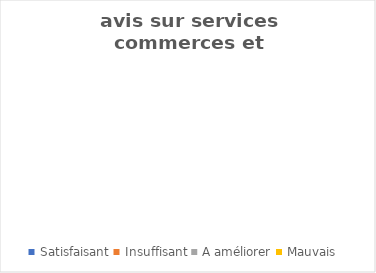
| Category | Series 0 |
|---|---|
| Satisfaisant | 0 |
| Insuffisant | 0 |
| A améliorer | 0 |
| Mauvais | 0 |